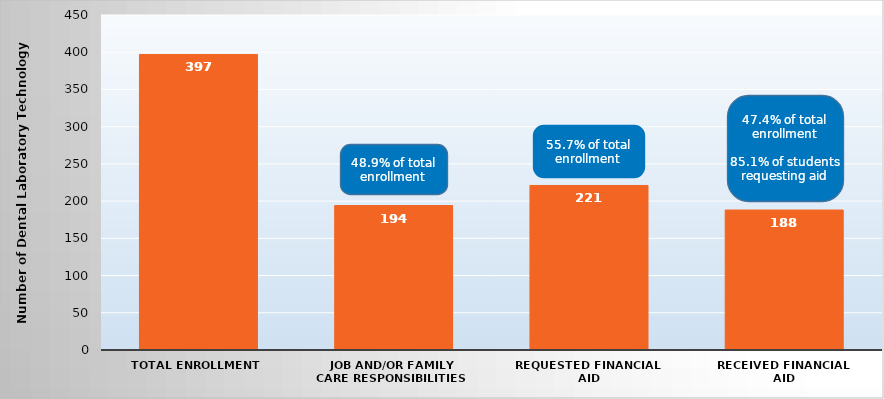
| Category | Series 0 |
|---|---|
| Total Enrollment | 397 |
| Job and/or Family Care Responsibilities | 194 |
| Requested Financial Aid | 221 |
| Received Financial Aid | 188 |